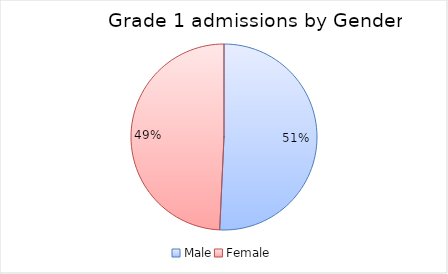
| Category | Series 0 |
|---|---|
| Male | 166753 |
| Female | 161879 |